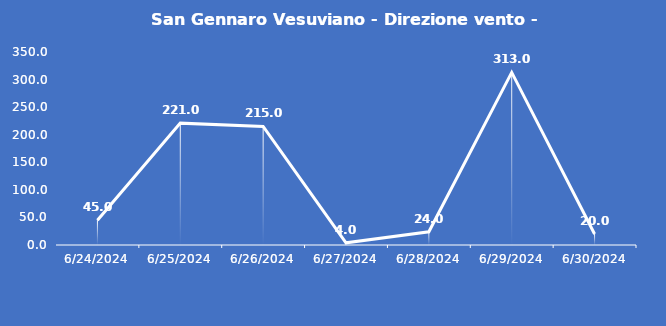
| Category | San Gennaro Vesuviano - Direzione vento - Grezzo (°N) |
|---|---|
| 6/24/24 | 45 |
| 6/25/24 | 221 |
| 6/26/24 | 215 |
| 6/27/24 | 4 |
| 6/28/24 | 24 |
| 6/29/24 | 313 |
| 6/30/24 | 20 |